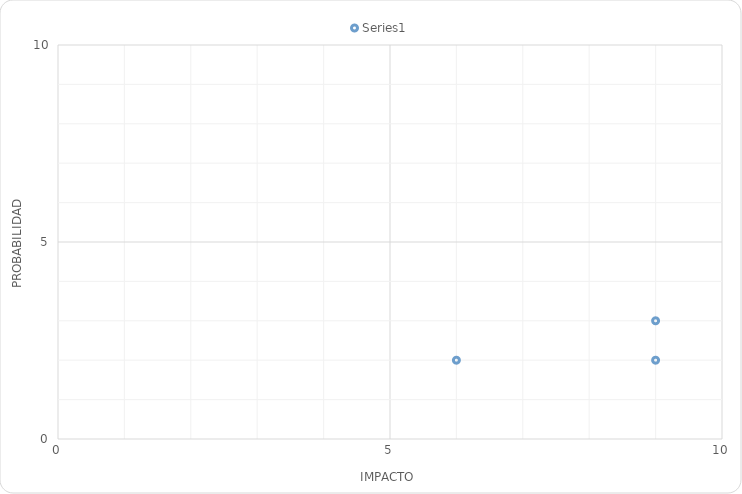
| Category | Series 0 |
|---|---|
| 9.0 | 3 |
| 9.0 | 2 |
| 6.0 | 2 |